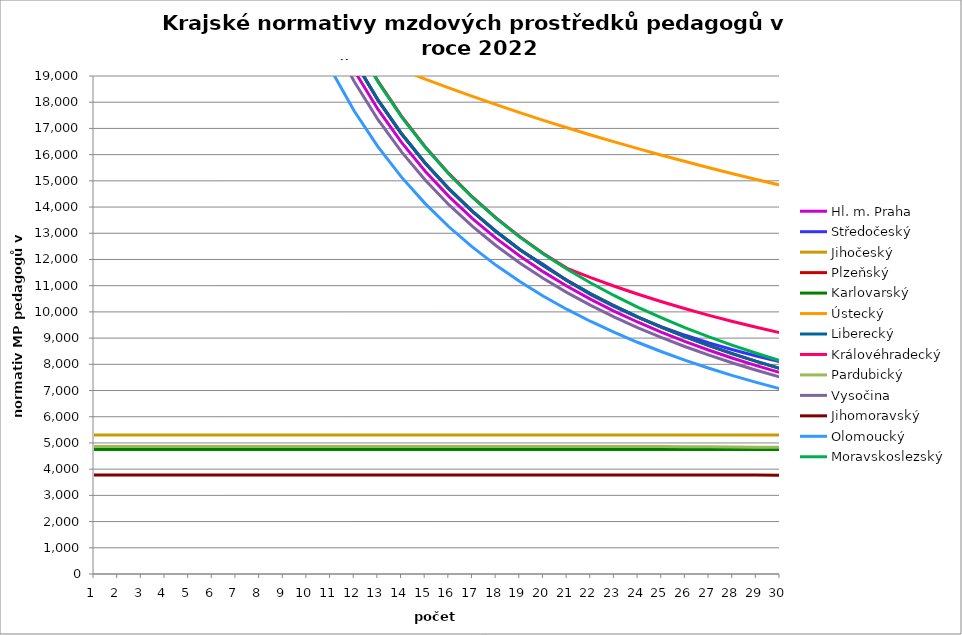
| Category | Hl. m. Praha | Středočeský | Jihočeský | Plzeňský | Karlovarský  | Ústecký   | Liberecký | Královéhradecký | Pardubický | Vysočina | Jihomoravský | Olomoucký | Moravskoslezský |
|---|---|---|---|---|---|---|---|---|---|---|---|---|---|
| 0 | 230520 | 235026 | 5305.814 | 235260 | 4750 | 207714 | 235200 | 244560 | 4866.689 | 32207.143 | 3780.621 | 211968 | 244200 |
| 1 | 115260 | 117513 | 5305.814 | 117630 | 4750 | 103857 | 117600 | 122280 | 4866.689 | 32207.143 | 3780.621 | 105984 | 122100 |
| 2 | 76840 | 78342 | 5305.814 | 78420 | 4750 | 69238 | 78400 | 81520 | 4866.689 | 32207.143 | 3780.621 | 70656 | 81400 |
| 3 | 57630 | 58756.5 | 5305.814 | 58815 | 4750 | 51928.5 | 58800 | 61140 | 4866.689 | 32207.143 | 3780.621 | 52992 | 61050 |
| 4 | 46104 | 47005.2 | 5305.814 | 47052 | 4750 | 41542.8 | 47040 | 48912 | 4866.689 | 32207.143 | 3780.621 | 42393.6 | 48840 |
| 5 | 38420 | 39171 | 5305.814 | 39210 | 4750 | 34619 | 39200 | 40760 | 4866.689 | 32207.143 | 3780.621 | 35328 | 40700 |
| 6 | 32931.429 | 33575.143 | 5305.814 | 33608.571 | 4750 | 29673.429 | 33600 | 34937.143 | 4866.689 | 32207.143 | 3780.621 | 30281.143 | 34885.714 |
| 7 | 28815 | 29378.25 | 5305.814 | 29407.5 | 4750 | 25964.25 | 29400 | 30570 | 4866.689 | 28181.25 | 3780.621 | 26496 | 30525 |
| 8 | 25613.333 | 26114 | 5305.814 | 26140 | 4750 | 23079.333 | 26133.333 | 27173.333 | 4866.689 | 25050 | 3780.621 | 23552 | 27133.333 |
| 9 | 23052 | 23502.6 | 5305.814 | 23526 | 4750 | 20771.4 | 23520 | 24456 | 4866.689 | 22545 | 3780.621 | 21196.8 | 24420 |
| 10 | 20956.364 | 21366 | 5305.814 | 21387.273 | 4750 | 20364.118 | 21381.818 | 22232.727 | 4866.689 | 20495.455 | 3780.621 | 19269.818 | 22200 |
| 11 | 19210 | 19585.5 | 5305.814 | 19605 | 4750 | 19972.5 | 19600 | 20380 | 4866.689 | 18787.5 | 3780.621 | 17664 | 20350 |
| 12 | 17732.308 | 18078.923 | 5305.814 | 18096.923 | 4750 | 19595.66 | 18092.308 | 18812.308 | 4866.689 | 17342.308 | 3780.621 | 16305.231 | 18784.615 |
| 13 | 16465.714 | 16787.571 | 5305.814 | 16804.286 | 4750 | 19232.778 | 16800 | 17468.571 | 4866.689 | 16103.571 | 3780.621 | 15140.571 | 17442.857 |
| 14 | 15368 | 15668.4 | 5305.814 | 15684 | 4750 | 18883.091 | 15680 | 16304 | 4866.689 | 15030 | 3780.621 | 14131.2 | 16280 |
| 15 | 14407.5 | 14689.125 | 5305.814 | 14703.75 | 4750 | 18545.893 | 14700 | 15285 | 4866.689 | 14090.625 | 3780.621 | 13248 | 15262.5 |
| 16 | 13560 | 13825.059 | 5305.814 | 13838.824 | 4750 | 18220.526 | 13835.294 | 14385.882 | 4866.689 | 13261.765 | 3780.621 | 12468.706 | 14364.706 |
| 17 | 12806.667 | 13057 | 5305.814 | 13070 | 4750 | 17906.379 | 13066.667 | 13586.667 | 4866.689 | 12525 | 3780.621 | 11776 | 13566.667 |
| 18 | 12132.632 | 12369.789 | 5305.814 | 12382.105 | 4750 | 17602.881 | 12378.947 | 12871.579 | 4866.689 | 11865.789 | 3780.621 | 11156.211 | 12852.632 |
| 19 | 11526 | 11807.992 | 5305.814 | 11763 | 4750 | 17309.5 | 11760 | 12228 | 4866.689 | 11272.5 | 3780.621 | 10598.4 | 12210 |
| 20 | 10977.143 | 11190.779 | 5305.814 | 11202.857 | 4750 | 17025.738 | 11200 | 11662.375 | 4866.689 | 10735.714 | 3780.621 | 10093.714 | 11628.571 |
| 21 | 10478.182 | 10659.522 | 5305.814 | 10693.636 | 4750 | 16751.129 | 10690.909 | 11309.133 | 4866.689 | 10247.727 | 3780.621 | 9634.909 | 11100 |
| 22 | 10022.609 | 10196.966 | 5305.814 | 10228.696 | 4750 | 16485.238 | 10226.087 | 10979.125 | 4866.689 | 9802.174 | 3780.306 | 9216 | 10617.391 |
| 23 | 9605 | 9790.216 | 5305.814 | 9802.5 | 4750 | 16227.656 | 9800 | 10674.814 | 4866.689 | 9393.75 | 3779.674 | 8832 | 10175 |
| 24 | 9220.8 | 9429.439 | 5305.814 | 9410.4 | 4750 | 15978 | 9408 | 10386.919 | 4866.689 | 9018 | 3779.043 | 8478.72 | 9768 |
| 25 | 8866.154 | 9107.003 | 5305.814 | 9048.462 | 4750 | 15735.909 | 9046.154 | 10120.422 | 4859.347 | 8671.154 | 3778.097 | 8152.615 | 9392.308 |
| 26 | 8537.778 | 8816.893 | 5305.814 | 8713.333 | 4750 | 15501.045 | 8711.111 | 9869.249 | 4852.43 | 8350 | 3776.836 | 7850.667 | 9044.444 |
| 27 | 8232.857 | 8554.301 | 5305.814 | 8402.143 | 4750 | 15273.088 | 8400 | 9634.036 | 4845.783 | 8051.786 | 3775.576 | 7570.286 | 8721.429 |
| 28 | 7948.966 | 8315.338 | 5305.814 | 8112.414 | 4750 | 15051.739 | 8110.345 | 9411.584 | 4839.386 | 7774.138 | 3774.002 | 7309.241 | 8420.69 |
| 29 | 7684 | 8096.823 | 5305.814 | 7842 | 4750 | 14836.714 | 7840 | 9204.366 | 4833.222 | 7515 | 3772.114 | 7065.6 | 8140 |